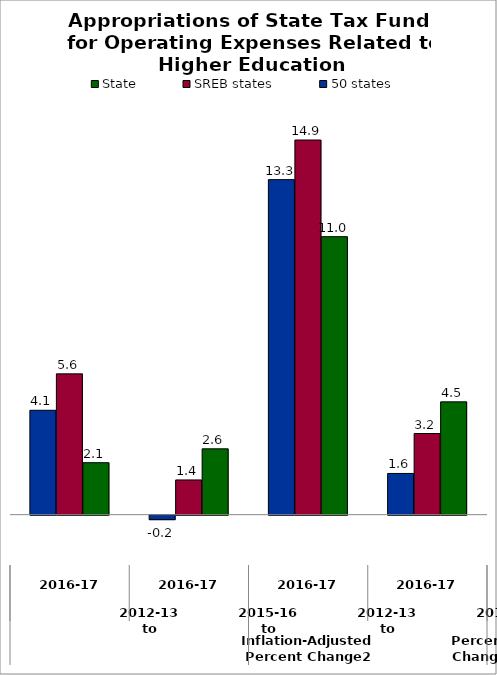
| Category | State | SREB states | 50 states |
|---|---|---|---|
| 0 | 4.483 | 3.224 | 1.638 |
| 1 | 11.046 | 14.886 | 13.313 |
| 2 | 2.616 | 1.38 | -0.178 |
| 3 | 2.065 | 5.594 | 4.148 |